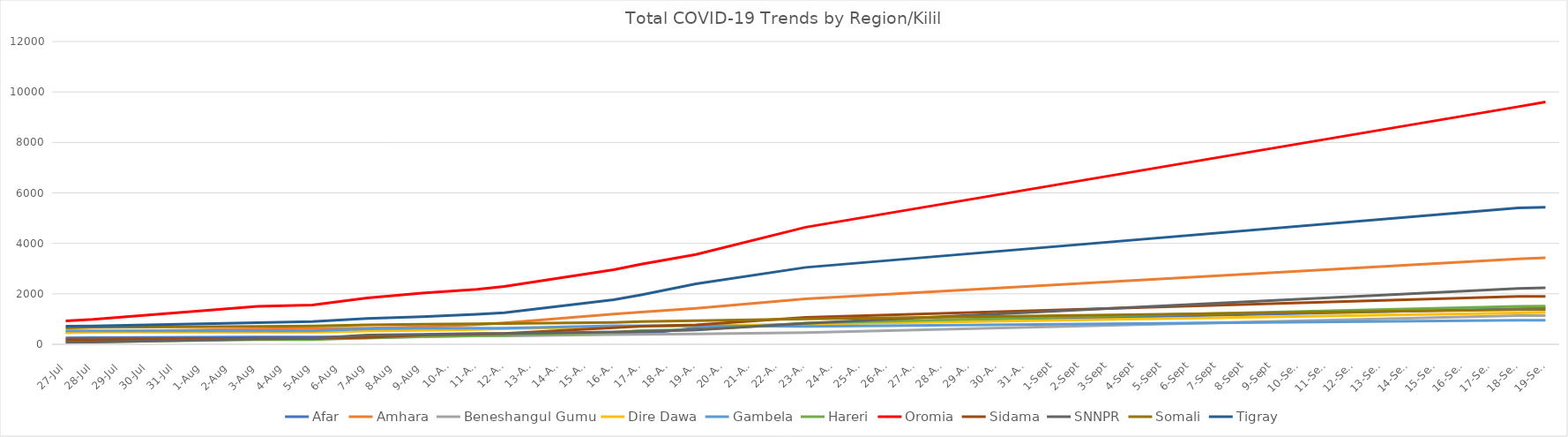
| Category | Afar | Amhara | Beneshangul Gumu | Dire Dawa | Gambela | Hareri | Oromia | Sidama | SNNPR | Somali | Tigray |
|---|---|---|---|---|---|---|---|---|---|---|---|
| 2020-07-27 | 256 | 484 | 149 | 459 | 531 | 94 | 923 | 182 | 83 | 651 | 713 |
| 2020-07-28 | 260 | 499 | 149 | 484 | 536 | 94 | 985 | 188 | 90 | 673 | 727 |
| 2020-08-03 | 292 | 607 | 219 | 484 | 536 | 181 | 1506 | 238 | 210 | 711 | 860 |
| 2020-08-05 | 293 | 627 | 221 | 484 | 536 | 181 | 1561 | 238 | 234 | 730 | 897 |
| 2020-08-07 | 299 | 641 | 245 | 528 | 614 | 256 | 1837 | 267 | 370 | 769 | 1019 |
| 2020-08-09 | 313 | 691 | 299 | 548 | 637 | 309 | 2026 | 366 | 393 | 795 | 1089 |
| 2020-08-11 | 391 | 780 | 333 | 588 | 637 | 342 | 2180 | 406 | 429 | 814 | 1189 |
| 2020-08-12 | 391 | 850 | 336 | 624 | 637 | 357 | 2288 | 430 | 432 | 821 | 1254 |
| 2020-08-16 | 415 | 1195 | 388 | 680 | 739 | 472 | 2953 | 658 | 488 | 866 | 1770 |
| 2020-08-17 | 415 | 1278 | 395 | 711 | 739 | 555 | 3177 | 721 | 503 | 901 | 1962 |
| 2020-08-19 | 650 | 1427 | 408 | 737 | 739 | 574 | 3557 | 774 | 567 | 933 | 2394 |
| 2020-08-23 | 803 | 1803 | 462 | 797 | 712 | 839 | 4640 | 1068 | 833 | 1007 | 3048 |
| 2020-09-18 | 1408 | 3388 | 1138 | 1246 | 954 | 1505 | 9415 | 1897 | 2211 | 1375 | 5403 |
| 2020-09-19 | 1447 | 3427 | 1138 | 1260 | 954 | 1514 | 9602 | 1897 | 2242 | 1376 | 5433 |